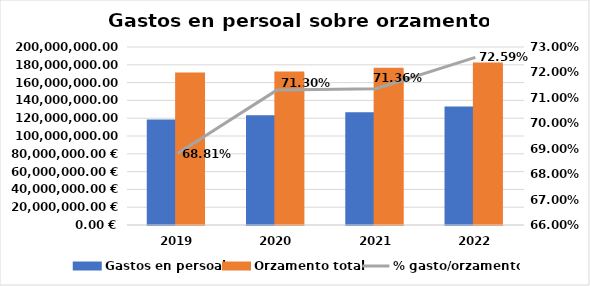
| Category | Gastos en persoal | Orzamento total |
|---|---|---|
| 2019.0 | 116781481.8 | 169720733.3 |
| 2020.0 | 121703395.175 | 170681126.09 |
| 2021.0 | 124970386.61 | 175131206.4 |
| 2022.0 | 131379928.34 | 180980048.67 |